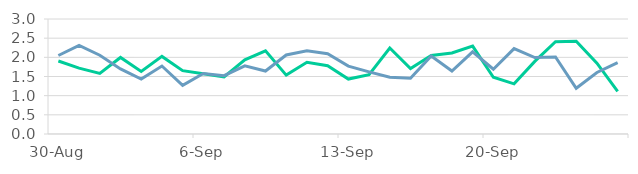
| Category | SNS | ABN |
|---|---|---|
| 2015-08-30 | 1.905 | 2.048 |
| 2015-08-31 | 1.718 | 2.311 |
| 2015-09-01 | 1.58 | 2.056 |
| 2015-09-02 | 1.997 | 1.698 |
| 2015-09-03 | 1.631 | 1.435 |
| 2015-09-04 | 2.024 | 1.773 |
| 2015-09-05 | 1.652 | 1.269 |
| 2015-09-06 | 1.573 | 1.577 |
| 2015-09-07 | 1.488 | 1.521 |
| 2015-09-08 | 1.937 | 1.779 |
| 2015-09-09 | 2.171 | 1.643 |
| 2015-09-10 | 1.536 | 2.061 |
| 2015-09-11 | 1.87 | 2.173 |
| 2015-09-12 | 1.781 | 2.095 |
| 2015-09-13 | 1.434 | 1.77 |
| 2015-09-14 | 1.546 | 1.622 |
| 2015-09-15 | 2.244 | 1.481 |
| 2015-09-16 | 1.709 | 1.453 |
| 2015-09-17 | 2.049 | 2.034 |
| 2015-09-18 | 2.113 | 1.643 |
| 2015-09-19 | 2.293 | 2.143 |
| 2015-09-20 | 1.479 | 1.691 |
| 2015-09-21 | 1.308 | 2.227 |
| 2015-09-22 | 1.893 | 1.994 |
| 2015-09-23 | 2.408 | 2.01 |
| 2015-09-24 | 2.42 | 1.194 |
| 2015-09-25 | 1.849 | 1.605 |
| 2015-09-26 | 1.111 | 1.86 |